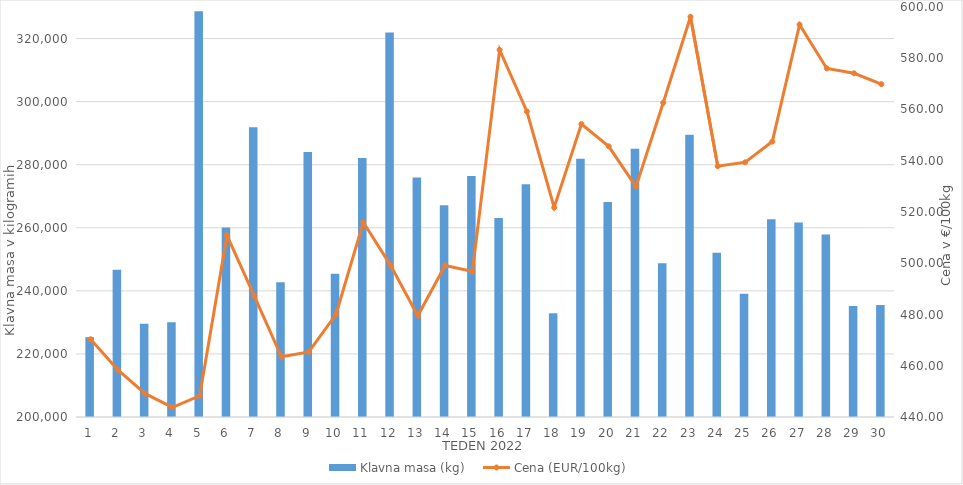
| Category | Klavna masa (kg) |
|---|---|
| 1.0 | 225300 |
| 2.0 | 246712 |
| 3.0 | 229541 |
| 4.0 | 230074 |
| 5.0 | 328640 |
| 6.0 | 260108 |
| 7.0 | 291887 |
| 8.0 | 242732 |
| 9.0 | 283987 |
| 10.0 | 245414 |
| 11.0 | 282092 |
| 12.0 | 321936 |
| 13.0 | 275950 |
| 14.0 | 267148 |
| 15.0 | 276417 |
| 16.0 | 263098 |
| 17.0 | 273824 |
| 18.0 | 232926 |
| 19.0 | 281859 |
| 20.0 | 268153 |
| 21.0 | 285073 |
| 22.0 | 248783 |
| 23.0 | 289478 |
| 24.0 | 252069 |
| 25.0 | 239099 |
| 26.0 | 262689 |
| 27.0 | 261656 |
| 28.0 | 257905 |
| 29.0 | 235185 |
| 30.0 | 235475 |